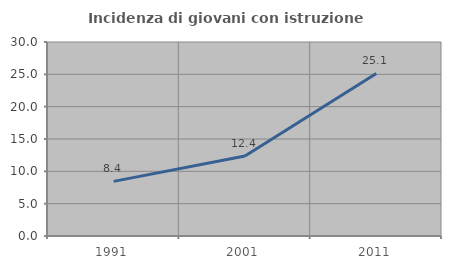
| Category | Incidenza di giovani con istruzione universitaria |
|---|---|
| 1991.0 | 8.444 |
| 2001.0 | 12.385 |
| 2011.0 | 25.137 |